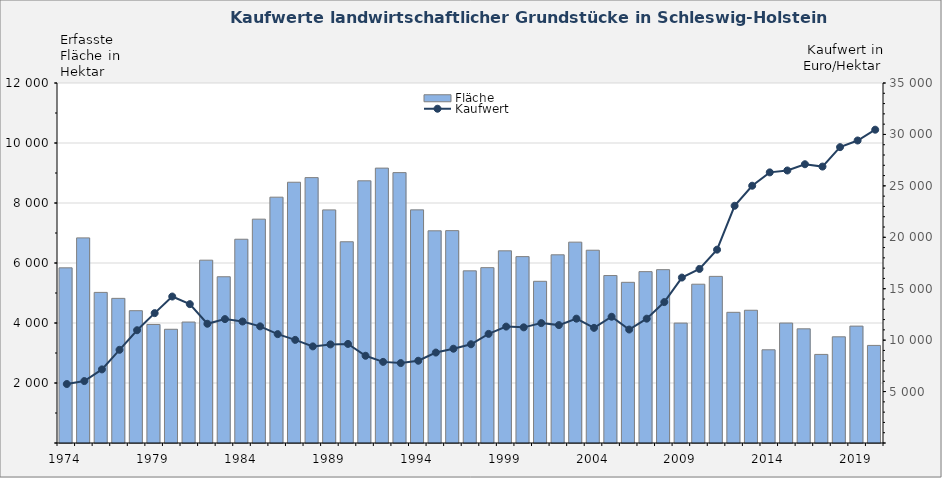
| Category | Fläche |
|---|---|
| 1974.0 | 5839 |
| 1975.0 | 6837 |
| 1976.0 | 5020 |
| 1977.0 | 4821 |
| 1978.0 | 4410 |
| 1979.0 | 3951 |
| 1980.0 | 3791 |
| 1981.0 | 4032 |
| 1982.0 | 6094 |
| 1983.0 | 5542 |
| 1984.0 | 6792 |
| 1985.0 | 7461 |
| 1986.0 | 8194 |
| 1987.0 | 8692 |
| 1988.0 | 8846 |
| 1989.0 | 7770 |
| 1990.0 | 6708 |
| 1991.0 | 8740 |
| 1992.0 | 9163 |
| 1993.0 | 9013 |
| 1994.0 | 7771 |
| 1995.0 | 7073 |
| 1996.0 | 7079 |
| 1997.0 | 5739 |
| 1998.0 | 5845 |
| 1999.0 | 6406 |
| 2000.0 | 6213 |
| 2001.0 | 5390 |
| 2002.0 | 6273 |
| 2003.0 | 6695 |
| 2004.0 | 6426 |
| 2005.0 | 5582 |
| 2006.0 | 5356 |
| 2007.0 | 5712 |
| 2008.0 | 5778 |
| 2009.0 | 3997 |
| 2010.0 | 5293 |
| 2011.0 | 5554 |
| 2012.0 | 4356 |
| 2013.0 | 4425 |
| 2014.0 | 3107 |
| 2015.0 | 3998 |
| 2016.0 | 3806 |
| 2017.0 | 2953 |
| 2018.0 | 3540 |
| 2019.0 | 3896 |
| 2020.0 | 3253 |